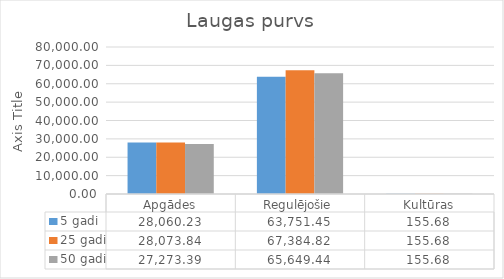
| Category | 5 gadi | 25 gadi | 50 gadi |
|---|---|---|---|
| Apgādes | 28060.229 | 28073.844 | 27273.387 |
| Regulējošie | 63751.454 | 67384.817 | 65649.445 |
| Kultūras | 155.684 | 155.684 | 155.684 |